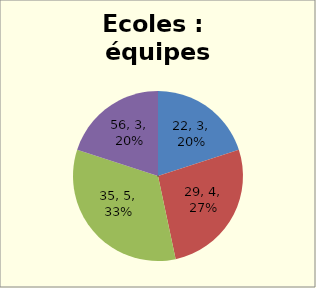
| Category | Series 0 |
|---|---|
| 22.0 | 3 |
| 29.0 | 4 |
| 35.0 | 5 |
| 56.0 | 3 |